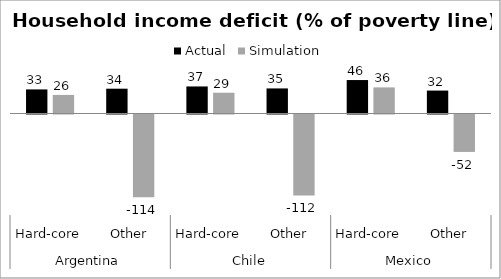
| Category | Actual | Simulation |
|---|---|---|
| 0 | 33.223 | 25.62 |
| 1 | 34.214 | -114.17 |
| 2 | 37.308 | 28.659 |
| 3 | 34.588 | -111.648 |
| 4 | 46.147 | 36.001 |
| 5 | 31.627 | -51.634 |